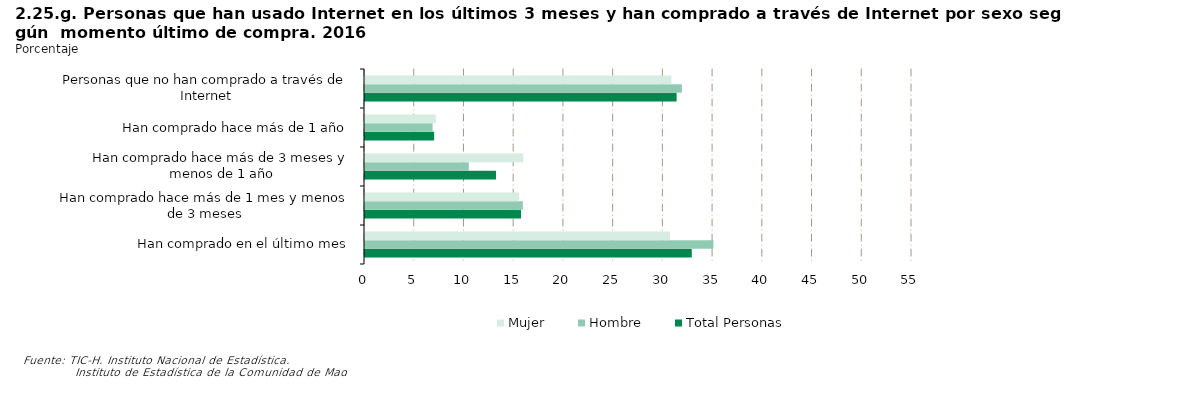
| Category | Total Personas | Hombre | Mujer |
|---|---|---|---|
| Han comprado en el último mes | 32.856 | 35.034 | 30.671 |
| Han comprado hace más de 1 mes y menos de 3 meses | 15.688 | 15.877 | 15.499 |
| Han comprado hace más de 3 meses y menos de 1 año | 13.169 | 10.436 | 15.911 |
| Han comprado hace más de 1 año | 6.953 | 6.795 | 7.112 |
| Personas que no han comprado a través de Internet | 31.334 | 31.858 | 30.807 |